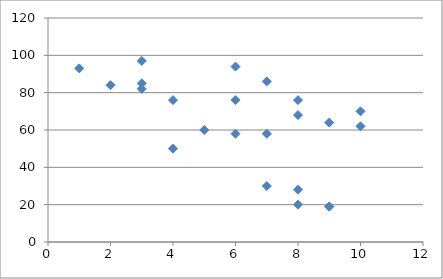
| Category | Series 0 |
|---|---|
| 3.0 | 97 |
| 2.0 | 84 |
| 6.0 | 76 |
| 8.0 | 68 |
| 5.0 | 60 |
| 9.0 | 64 |
| 6.0 | 58 |
| 8.0 | 20 |
| 3.0 | 82 |
| 4.0 | 76 |
| 9.0 | 19 |
| 3.0 | 85 |
| 7.0 | 58 |
| 10.0 | 62 |
| 9.0 | 19 |
| 6.0 | 94 |
| 8.0 | 28 |
| 1.0 | 93 |
| 10.0 | 70 |
| 8.0 | 76 |
| 7.0 | 86 |
| 4.0 | 50 |
| 7.0 | 30 |